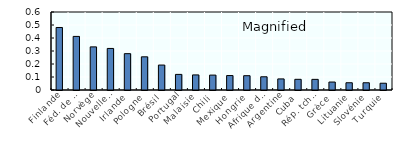
| Category | Series 0 |
|---|---|
| Finlande | 0.481 |
| Féd. de Russie | 0.412 |
| Norvège | 0.332 |
| Nouvelle-Zélande | 0.32 |
| Irlande | 0.279 |
| Pologne | 0.255 |
| Brésil | 0.192 |
| Portugal | 0.12 |
| Malaisie | 0.116 |
| Chili | 0.115 |
| Mexique | 0.111 |
| Hongrie | 0.11 |
| Afrique du Sud | 0.102 |
| Argentine | 0.085 |
| Cuba | 0.082 |
| Rép. tchèque | 0.082 |
| Grèce | 0.061 |
| Lituanie | 0.056 |
| Slovénie | 0.056 |
| Turquie | 0.052 |